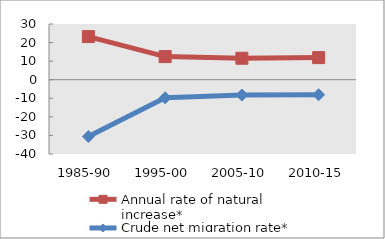
| Category | Annual rate of natural increase* | Crude net migration rate* |
|---|---|---|
| 1985-90 | 23.202 | -30.584 |
| 1995-00 | 12.442 | -9.733 |
| 2005-10 | 11.559 | -8.234 |
| 2010-15 | 11.905 | -8.088 |